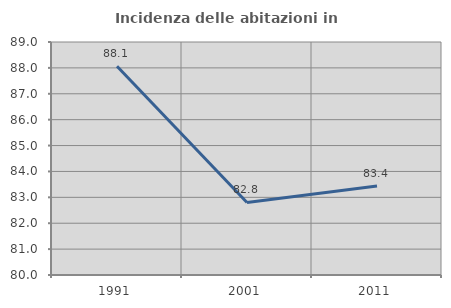
| Category | Incidenza delle abitazioni in proprietà  |
|---|---|
| 1991.0 | 88.066 |
| 2001.0 | 82.803 |
| 2011.0 | 83.442 |